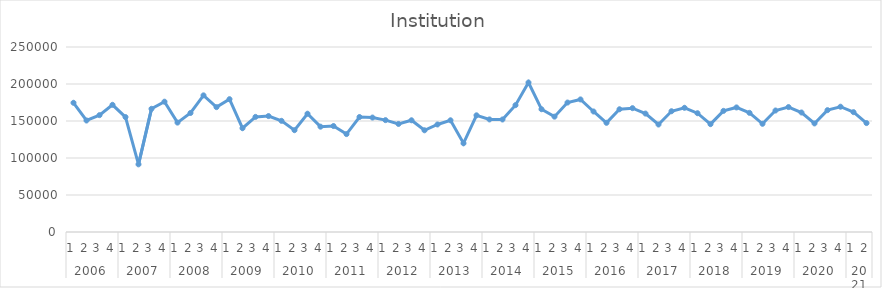
| Category | Institution |
|---|---|
| 0 | 174623 |
| 1 | 150684 |
| 2 | 157920 |
| 3 | 171882 |
| 4 | 155328 |
| 5 | 91418 |
| 6 | 166479 |
| 7 | 176095 |
| 8 | 147848 |
| 9 | 160813 |
| 10 | 184654 |
| 11 | 168746 |
| 12 | 179493 |
| 13 | 140237 |
| 14 | 155562 |
| 15 | 156654 |
| 16 | 150220 |
| 17 | 137595 |
| 18 | 159846 |
| 19 | 142337 |
| 20 | 143202 |
| 21 | 132310 |
| 22 | 155399 |
| 23 | 154654 |
| 24 | 151191 |
| 25 | 146026 |
| 26 | 150987 |
| 27 | 137449 |
| 28 | 145304 |
| 29 | 150955 |
| 30 | 119860 |
| 31 | 157687 |
| 32 | 152128 |
| 33 | 152055 |
| 34 | 171399 |
| 35 | 202038 |
| 36 | 165906 |
| 37 | 155878 |
| 38 | 174920 |
| 39 | 179152 |
| 40 | 162857 |
| 41 | 147557 |
| 42 | 165877 |
| 43 | 167355.44 |
| 44 | 160030.225 |
| 45 | 145250.953 |
| 46 | 163194.135 |
| 47 | 167843.811 |
| 48 | 160518.596 |
| 49 | 145739.324 |
| 50 | 163682.505 |
| 51 | 168332.182 |
| 52 | 161006.967 |
| 53 | 146227.695 |
| 54 | 164170.876 |
| 55 | 168820.553 |
| 56 | 161495.338 |
| 57 | 146716.065 |
| 58 | 164659.247 |
| 59 | 169308.924 |
| 60 | 161983.709 |
| 61 | 147204.436 |